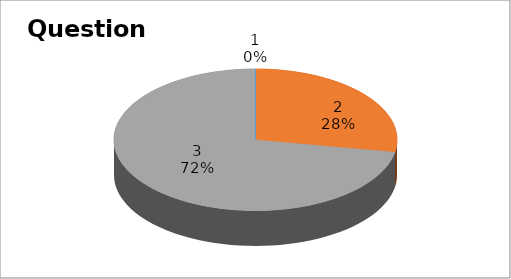
| Category | Series 0 |
|---|---|
| 0 | 0 |
| 1 | 10 |
| 2 | 26 |